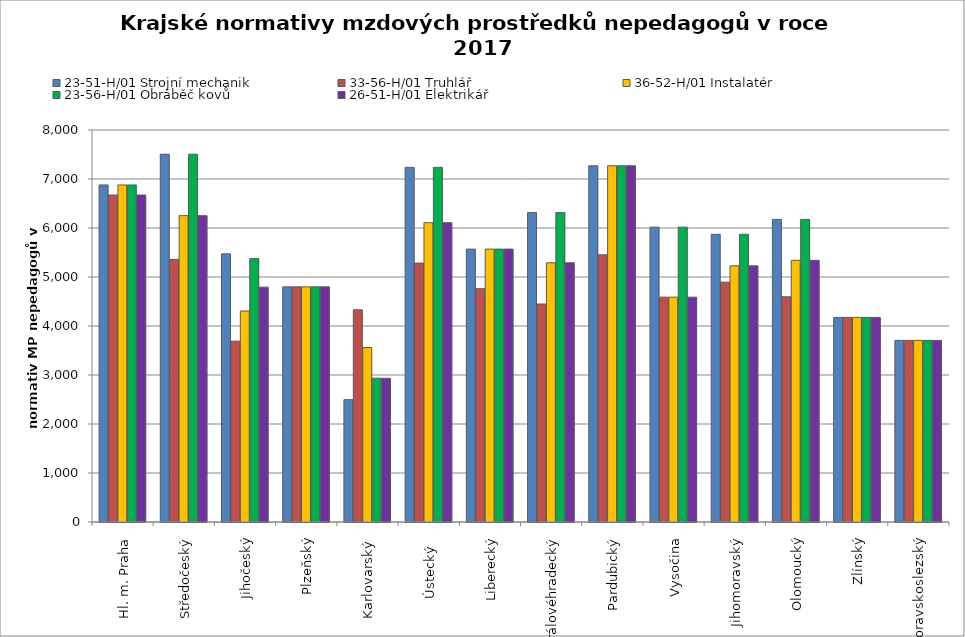
| Category | 23-51-H/01 Strojní mechanik | 33-56-H/01 Truhlář | 36-52-H/01 Instalatér | 23-56-H/01 Obráběč kovů | 26-51-H/01 Elektrikář |
|---|---|---|---|---|---|
| Hl. m. Praha | 6878.769 | 6673.433 | 6878.769 | 6878.769 | 6673.433 |
| Středočeský | 7505.886 | 5358.894 | 6252.308 | 7505.886 | 6252.308 |
| Jihočeský | 5472.19 | 3691.068 | 4306.393 | 5374.327 | 4792.894 |
| Plzeňský | 4798.558 | 4798.558 | 4798.558 | 4798.558 | 4798.558 |
| Karlovarský  | 2496.974 | 4330.189 | 3559.519 | 2934.736 | 2932.907 |
| Ústecký   | 7237.029 | 5284.339 | 6108.424 | 7237.029 | 6108.424 |
| Liberecký | 5569.454 | 4760.525 | 5569.454 | 5569.454 | 5569.454 |
| Královéhradecký | 6313.864 | 4449.118 | 5290.132 | 6313.864 | 5290.132 |
| Pardubický | 7270 | 5452.5 | 7270 | 7270 | 7270 |
| Vysočina | 6017.502 | 4588.781 | 4588.781 | 6017.502 | 4588.781 |
| Jihomoravský | 5870.989 | 4894.525 | 5227.831 | 5870.989 | 5227.831 |
| Olomoucký | 6175.746 | 4595.373 | 5340.468 | 6175.746 | 5340.468 |
| Zlínský | 4175.51 | 4175.51 | 4175.51 | 4175.51 | 4175.51 |
| Moravskoslezský | 3706.47 | 3706.47 | 3706.47 | 3706.47 | 3706.47 |